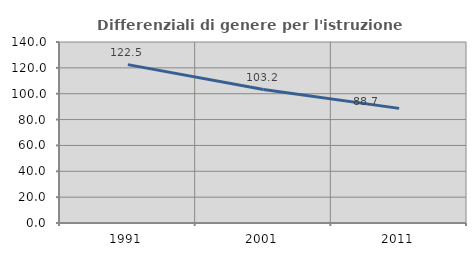
| Category | Differenziali di genere per l'istruzione superiore |
|---|---|
| 1991.0 | 122.518 |
| 2001.0 | 103.207 |
| 2011.0 | 88.655 |